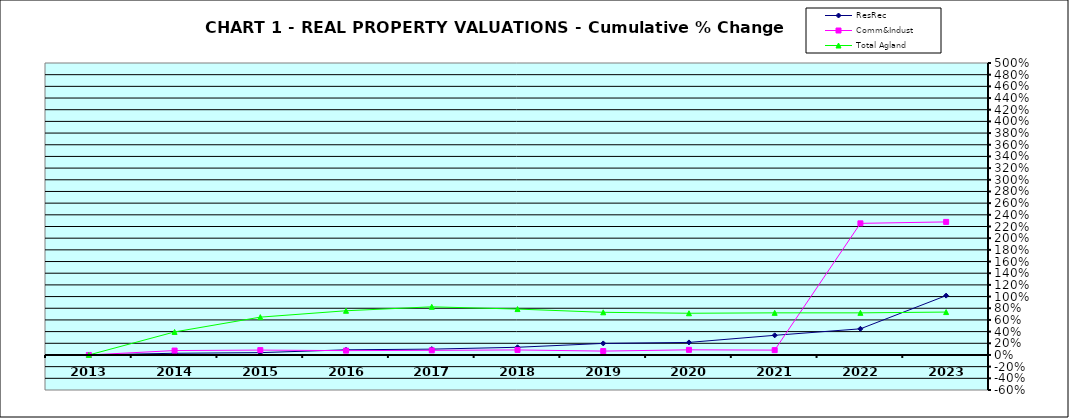
| Category | ResRec | Comm&Indust | Total Agland |
|---|---|---|---|
| 2013.0 | 0 | 0 | 0 |
| 2014.0 | 0.029 | 0.075 | 0.395 |
| 2015.0 | 0.04 | 0.083 | 0.648 |
| 2016.0 | 0.088 | 0.074 | 0.757 |
| 2017.0 | 0.1 | 0.079 | 0.824 |
| 2018.0 | 0.132 | 0.086 | 0.786 |
| 2019.0 | 0.198 | 0.067 | 0.73 |
| 2020.0 | 0.215 | 0.088 | 0.714 |
| 2021.0 | 0.336 | 0.083 | 0.721 |
| 2022.0 | 0.448 | 2.254 | 0.721 |
| 2023.0 | 1.016 | 2.279 | 0.735 |